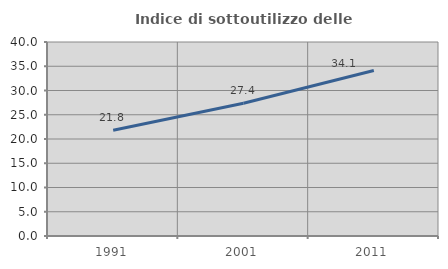
| Category | Indice di sottoutilizzo delle abitazioni  |
|---|---|
| 1991.0 | 21.817 |
| 2001.0 | 27.37 |
| 2011.0 | 34.122 |